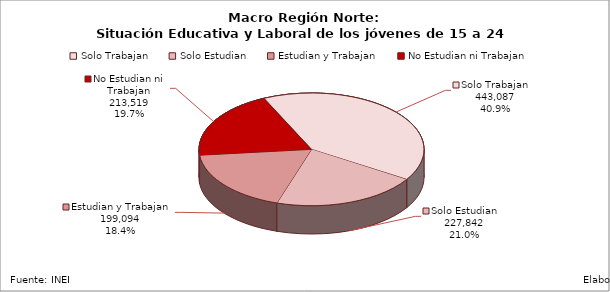
| Category | Series 0 |
|---|---|
| Solo Trabajan | 443086.61 |
| Solo Estudian | 227842.42 |
| Estudian y Trabajan | 199093.74 |
| No Estudian ni Trabajan | 213518.7 |